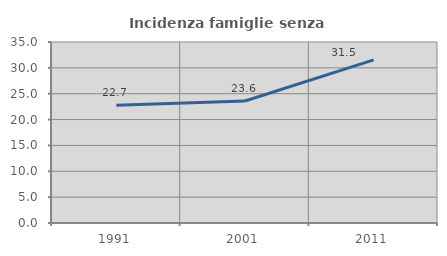
| Category | Incidenza famiglie senza nuclei |
|---|---|
| 1991.0 | 22.747 |
| 2001.0 | 23.598 |
| 2011.0 | 31.542 |